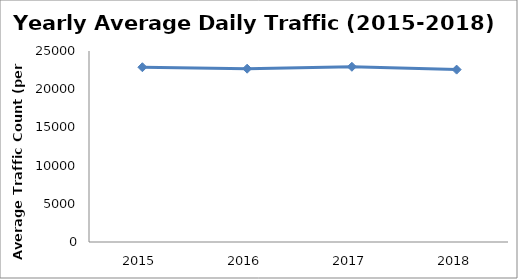
| Category | Series 0 |
|---|---|
| 2015.0 | 22875.638 |
| 2016.0 | 22683.817 |
| 2017.0 | 22935.038 |
| 2018.0 | 22562.26 |